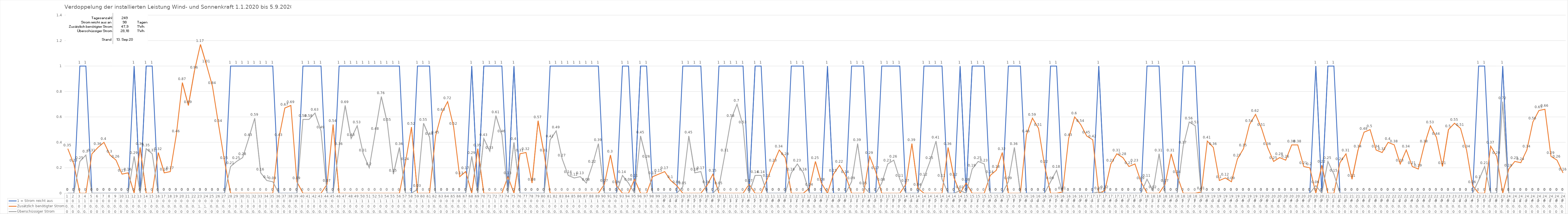
| Category | 1 = Strom reicht aus | Zusätzlich benötigter Strom | Überschüssiger Strom |
|---|---|---|---|
| 0 | 0 | 0.35 | 0 |
| 1 | 0 | 0.23 | 0 |
| 2 | 1 | 0 | 0.25 |
| 3 | 1 | 0 | 0.3 |
| 4 | 0 | 0.31 | 0 |
| 5 | 0 | 0.36 | 0 |
| 6 | 0 | 0.4 | 0 |
| 7 | 0 | 0.3 | 0 |
| 8 | 0 | 0.26 | 0 |
| 9 | 0 | 0.15 | 0 |
| 10 | 0 | 0.16 | 0 |
| 11 | 1 | 0 | 0.29 |
| 12 | 0 | 0.36 | 0 |
| 13 | 1 | 0 | 0.35 |
| 14 | 1 | 0 | 0.31 |
| 15 | 0 | 0.32 | 0 |
| 16 | 0 | 0.16 | 0 |
| 17 | 0 | 0.17 | 0 |
| 18 | 0 | 0.46 | 0 |
| 19 | 0 | 0.87 | 0 |
| 20 | 0 | 0.69 | 0 |
| 21 | 0 | 0.96 | 0 |
| 22 | 0 | 1.17 | 0 |
| 23 | 0 | 1.01 | 0 |
| 24 | 0 | 0.84 | 0 |
| 25 | 0 | 0.54 | 0 |
| 26 | 0 | 0.25 | 0 |
| 27 | 1 | 0 | 0.21 |
| 28 | 1 | 0 | 0.25 |
| 29 | 1 | 0 | 0.28 |
| 30 | 1 | 0 | 0.43 |
| 31 | 1 | 0 | 0.59 |
| 32 | 1 | 0 | 0.16 |
| 33 | 1 | 0 | 0.1 |
| 34 | 1 | 0 | 0.09 |
| 35 | 0 | 0.43 | 0 |
| 36 | 0 | 0.67 | 0 |
| 37 | 0 | 0.69 | 0 |
| 38 | 0 | 0.09 | 0 |
| 39 | 1 | 0 | 0.58 |
| 40 | 1 | 0 | 0.58 |
| 41 | 1 | 0 | 0.63 |
| 42 | 1 | 0 | 0.49 |
| 43 | 0 | 0.07 | 0 |
| 44 | 0 | 0.54 | 0 |
| 45 | 1 | 0 | 0.36 |
| 46 | 1 | 0 | 0.69 |
| 47 | 1 | 0 | 0.43 |
| 48 | 1 | 0 | 0.53 |
| 49 | 1 | 0 | 0.31 |
| 50 | 1 | 0 | 0.2 |
| 51 | 1 | 0 | 0.48 |
| 52 | 1 | 0 | 0.76 |
| 53 | 1 | 0 | 0.55 |
| 54 | 1 | 0 | 0.15 |
| 55 | 1 | 0 | 0.36 |
| 56 | 0 | 0.24 | 0 |
| 57 | 0 | 0.52 | 0 |
| 58 | 1 | 0 | 0.03 |
| 59 | 1 | 0 | 0.55 |
| 60 | 1 | 0 | 0.44 |
| 61 | 0 | 0.45 | 0 |
| 62 | 0 | 0.63 | 0 |
| 63 | 0 | 0.72 | 0 |
| 64 | 0 | 0.52 | 0 |
| 65 | 0 | 0.13 | 0 |
| 66 | 0 | 0.17 | 0 |
| 67 | 1 | 0 | 0.29 |
| 68 | 0 | 0.35 | 0 |
| 69 | 1 | 0 | 0.43 |
| 70 | 1 | 0 | 0.33 |
| 71 | 1 | 0 | 0.61 |
| 72 | 1 | 0 | 0.46 |
| 73 | 0 | 0.13 | 0 |
| 74 | 1 | 0 | 0.4 |
| 75 | 0 | 0.31 | 0 |
| 76 | 0 | 0.32 | 0 |
| 77 | 0 | 0.08 | 0 |
| 78 | 0 | 0.57 | 0 |
| 79 | 0 | 0.31 | 0 |
| 80 | 1 | 0 | 0.42 |
| 81 | 1 | 0 | 0.49 |
| 82 | 1 | 0 | 0.27 |
| 83 | 1 | 0 | 0.14 |
| 84 | 1 | 0 | 0.12 |
| 85 | 1 | 0 | 0.13 |
| 86 | 1 | 0 | 0.08 |
| 87 | 1 | 0 | 0.22 |
| 88 | 1 | 0 | 0.39 |
| 89 | 0 | 0.07 | 0 |
| 90 | 0 | 0.3 | 0 |
| 91 | 0 | 0.06 | 0 |
| 92 | 1 | 0 | 0.14 |
| 93 | 1 | 0 | 0.08 |
| 94 | 0 | 0.11 | 0 |
| 95 | 1 | 0 | 0.45 |
| 96 | 1 | 0 | 0.26 |
| 97 | 0 | 0.13 | 0 |
| 98 | 0 | 0.15 | 0 |
| 99 | 0 | 0.17 | 0 |
| 100 | 0 | 0.1 | 0 |
| 101 | 0 | 0.06 | 0 |
| 102 | 1 | 0 | 0.05 |
| 103 | 1 | 0 | 0.45 |
| 104 | 1 | 0 | 0.16 |
| 105 | 1 | 0 | 0.17 |
| 106 | 0 | 0.06 | 0 |
| 107 | 0 | 0.15 | 0 |
| 108 | 1 | 0 | 0.05 |
| 109 | 1 | 0 | 0.31 |
| 110 | 1 | 0 | 0.58 |
| 111 | 1 | 0 | 0.7 |
| 112 | 1 | 0 | 0.53 |
| 113 | 0 | 0.07 | 0 |
| 114 | 1 | 0 | 0.14 |
| 115 | 1 | 0 | 0.14 |
| 116 | 0 | 0.11 | 0 |
| 117 | 0 | 0.23 | 0 |
| 118 | 0 | 0.34 | 0 |
| 119 | 0 | 0.28 | 0 |
| 120 | 1 | 0 | 0.16 |
| 121 | 1 | 0 | 0.23 |
| 122 | 1 | 0 | 0.16 |
| 123 | 0 | 0.04 | 0 |
| 124 | 0 | 0.25 | 0 |
| 125 | 0 | 0.08 | 0 |
| 126 | 1 | 0 | 0 |
| 127 | 0 | 0.15 | 0 |
| 128 | 0 | 0.22 | 0 |
| 129 | 0 | 0.14 | 0 |
| 130 | 1 | 0 | 0.09 |
| 131 | 1 | 0 | 0.39 |
| 132 | 1 | 0 | 0.05 |
| 133 | 0 | 0.29 | 0 |
| 134 | 0 | 0.17 | 0 |
| 135 | 1 | 0 | 0.08 |
| 136 | 1 | 0 | 0.23 |
| 137 | 1 | 0 | 0.26 |
| 138 | 1 | 0 | 0.11 |
| 139 | 0 | 0.07 | 0 |
| 140 | 0 | 0.39 | 0 |
| 141 | 0 | 0.04 | 0 |
| 142 | 1 | 0 | 0.12 |
| 143 | 1 | 0 | 0.25 |
| 144 | 1 | 0 | 0.41 |
| 145 | 1 | 0 | 0.11 |
| 146 | 0 | 0.36 | 0 |
| 147 | 0 | 0.12 | 0 |
| 148 | 1 | 0 | 0.02 |
| 149 | 0 | 0.08 | 0 |
| 150 | 1 | 0 | 0.19 |
| 151 | 1 | 0 | 0.25 |
| 152 | 1 | 0 | 0.23 |
| 153 | 0 | 0.14 | 0 |
| 154 | 0 | 0.18 | 0 |
| 155 | 0 | 0.32 | 0 |
| 156 | 1 | 0 | 0.09 |
| 157 | 1 | 0 | 0.36 |
| 158 | 1 | 0 | 0 |
| 159 | 0 | 0.46 | 0 |
| 160 | 0 | 0.59 | 0 |
| 161 | 0 | 0.51 | 0 |
| 162 | 0 | 0.22 | 0 |
| 163 | 1 | 0 | 0.09 |
| 164 | 1 | 0 | 0.18 |
| 165 | 0 | 0.01 | 0 |
| 166 | 0 | 0.43 | 0 |
| 167 | 0 | 0.6 | 0 |
| 168 | 0 | 0.54 | 0 |
| 169 | 0 | 0.45 | 0 |
| 170 | 0 | 0.42 | 0 |
| 171 | 1 | 0 | 0.01 |
| 172 | 0 | 0.02 | 0 |
| 173 | 0 | 0.23 | 0 |
| 174 | 0 | 0.31 | 0 |
| 175 | 0 | 0.28 | 0 |
| 176 | 0 | 0.21 | 0 |
| 177 | 0 | 0.23 | 0 |
| 178 | 0 | 0.09 | 0 |
| 179 | 1 | 0 | 0.11 |
| 180 | 1 | 0 | 0.02 |
| 181 | 1 | 0 | 0.31 |
| 182 | 0 | 0.07 | 0 |
| 183 | 0 | 0.31 | 0 |
| 184 | 0 | 0.14 | 0 |
| 185 | 1 | 0 | 0.37 |
| 186 | 1 | 0 | 0.56 |
| 187 | 1 | 0 | 0.53 |
| 188 | 0 | 0.01 | 0 |
| 189 | 0 | 0.41 | 0 |
| 190 | 0 | 0.36 | 0 |
| 191 | 0 | 0.1 | 0 |
| 192 | 0 | 0.12 | 0 |
| 193 | 0 | 0.09 | 0 |
| 194 | 0 | 0.27 | 0 |
| 195 | 0 | 0.35 | 0 |
| 196 | 0 | 0.54 | 0 |
| 197 | 0 | 0.62 | 0 |
| 198 | 0 | 0.51 | 0 |
| 199 | 0 | 0.36 | 0 |
| 200 | 0 | 0.25 | 0 |
| 201 | 0 | 0.28 | 0 |
| 202 | 0 | 0.26 | 0 |
| 203 | 0 | 0.38 | 0 |
| 204 | 0 | 0.38 | 0 |
| 205 | 0 | 0.21 | 0 |
| 206 | 0 | 0.2 | 0 |
| 207 | 1 | 0 | 0.06 |
| 208 | 0 | 0.22 | 0 |
| 209 | 1 | 0 | 0.25 |
| 210 | 1 | 0 | 0.15 |
| 211 | 0 | 0.24 | 0 |
| 212 | 0 | 0.31 | 0 |
| 213 | 0 | 0.11 | 0 |
| 214 | 0 | 0.34 | 0 |
| 215 | 0 | 0.48 | 0 |
| 216 | 0 | 0.5 | 0 |
| 217 | 0 | 0.34 | 0 |
| 218 | 0 | 0.32 | 0 |
| 219 | 0 | 0.4 | 0 |
| 220 | 0 | 0.38 | 0 |
| 221 | 0 | 0.23 | 0 |
| 222 | 0 | 0.34 | 0 |
| 223 | 0 | 0.21 | 0 |
| 224 | 0 | 0.19 | 0 |
| 225 | 0 | 0.38 | 0 |
| 226 | 0 | 0.53 | 0 |
| 227 | 0 | 0.44 | 0 |
| 228 | 0 | 0.21 | 0 |
| 229 | 0 | 0.5 | 0 |
| 230 | 0 | 0.55 | 0 |
| 231 | 0 | 0.51 | 0 |
| 232 | 0 | 0.34 | 0 |
| 233 | 0 | 0.06 | 0 |
| 234 | 1 | 0 | 0.1 |
| 235 | 1 | 0 | 0.21 |
| 236 | 0 | 0.37 | 0 |
| 237 | 0 | 0.29 | 0 |
| 238 | 1 | 0 | 0.72 |
| 239 | 0 | 0.19 | 0 |
| 240 | 0 | 0.25 | 0 |
| 241 | 0 | 0.24 | 0 |
| 242 | 0 | 0.34 | 0 |
| 243 | 0 | 0.56 | 0 |
| 244 | 0 | 0.65 | 0 |
| 245 | 0 | 0.66 | 0 |
| 246 | 0 | 0.29 | 0 |
| 247 | 0 | 0.26 | 0 |
| 248 | 0 | 0.16 | 0 |